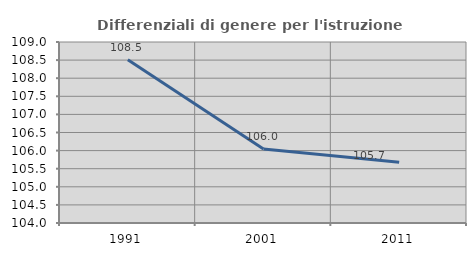
| Category | Differenziali di genere per l'istruzione superiore |
|---|---|
| 1991.0 | 108.511 |
| 2001.0 | 106.042 |
| 2011.0 | 105.676 |